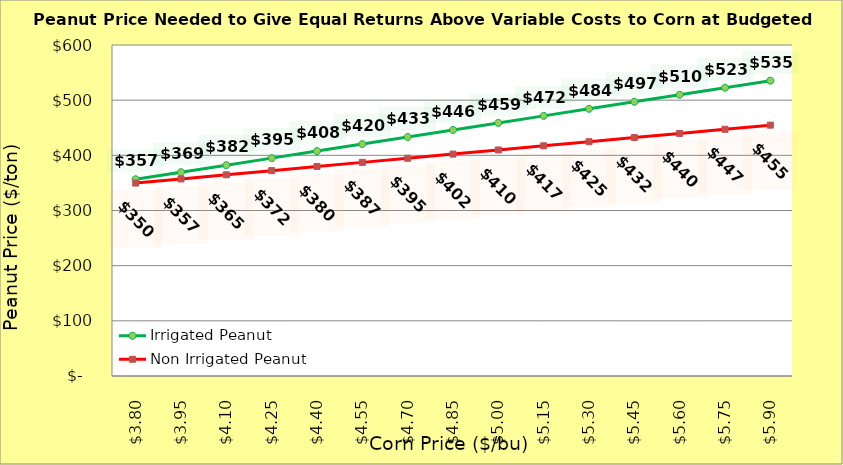
| Category | Irrigated Peanut | Non Irrigated Peanut |
|---|---|---|
| 3.799999999999998 | 356.623 | 349.727 |
| 3.949999999999998 | 369.389 | 357.227 |
| 4.099999999999998 | 382.155 | 364.727 |
| 4.249999999999998 | 394.921 | 372.227 |
| 4.399999999999999 | 407.687 | 379.727 |
| 4.549999999999999 | 420.453 | 387.227 |
| 4.699999999999999 | 433.219 | 394.727 |
| 4.85 | 445.985 | 402.227 |
| 5.0 | 458.751 | 409.727 |
| 5.15 | 471.517 | 417.227 |
| 5.300000000000001 | 484.283 | 424.727 |
| 5.450000000000001 | 497.049 | 432.227 |
| 5.600000000000001 | 509.815 | 439.727 |
| 5.750000000000002 | 522.581 | 447.227 |
| 5.900000000000002 | 535.347 | 454.727 |